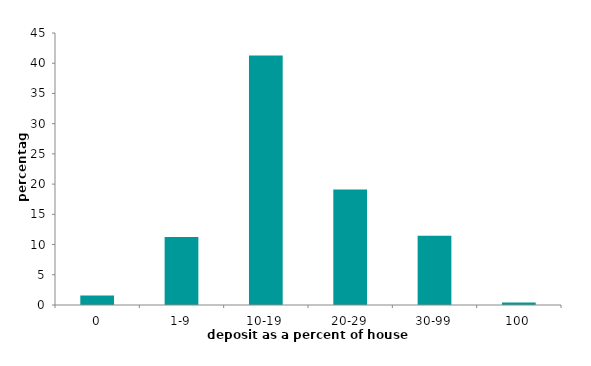
| Category | Series 1 |
|---|---|
| 0 | 1.586 |
| 1-9 | 11.235 |
| 10-19 | 41.273 |
| 20-29 | 19.129 |
| 30-99 | 11.469 |
| 100 | 0.422 |